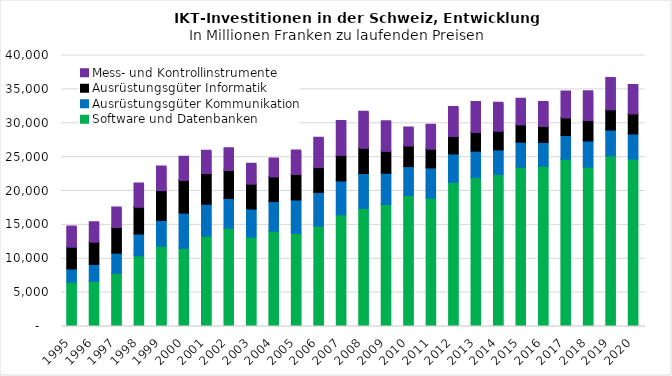
| Category | Software und Datenbanken | Ausrüstungsgüter Kommunikation | Ausrüstungsgüter Informatik  | Mess- und Kontrollinstrumente |
|---|---|---|---|---|
| 1995 | 6436.974 | 1932.607 | 3215.025 | 3013.026 |
| 1996 | 6505.206 | 2525.826 | 3306.745 | 2905.805 |
| 1997 | 7721.137 | 2992.353 | 3745.888 | 2942.249 |
| 1998 | 10290.014 | 3237.08 | 3951.646 | 3493.702 |
| 1999 | 11745.695 | 3777.255 | 4388.485 | 3574.735 |
| 2000 | 11397.467 | 5222.148 | 4824.11 | 3473.572 |
| 2001 | 13208.451 | 4711.946 | 4509.412 | 3351.724 |
| 2002 | 14388.685 | 4390.554 | 4094.445 | 3290.198 |
| 2003 | 13081.074 | 4139.164 | 3681.682 | 2964.209 |
| 2004 | 13932.139 | 4364.295 | 3653.253 | 2707.98 |
| 2005 | 13622.642 | 4923.677 | 3771.475 | 3512.966 |
| 2006 | 14670.94 | 4981.154 | 3665.483 | 4407.49 |
| 2007 | 16351.603 | 5008.272 | 3778.687 | 5050.358 |
| 2008 | 17292.851 | 5150.642 | 3744.536 | 5359.058 |
| 2009 | 17888.764 | 4609.07 | 3235.09 | 4414.029 |
| 2010 | 19189.062 | 4262.12 | 3065.567 | 2697.425 |
| 2011 | 18837.31 | 4446.192 | 2775.97 | 3579.996 |
| 2012 | 21153.184 | 4187.448 | 2577.624 | 4341.81 |
| 2013 | 21860.302 | 3909.083 | 2729.59 | 4488.356 |
| 2014 | 22331.28 | 3608.76 | 2768.95 | 4167.834 |
| 2015 | 23386.728 | 3699.743 | 2558.782 | 3817.776 |
| 2016 | 23534.812 | 3510.579 | 2367.3 | 3582.436 |
| 2017 | 24544.105 | 3508.73 | 2611.79 | 3888.984 |
| 2018 | 23402.265 | 3861.238 | 2979.219 | 4328.912 |
| 2019 | 25057.346 | 3819.77 | 2982.206 | 4687.401 |
| 2020 | 24588.979 | 3699.336 | 2966.188 | 4249.426 |